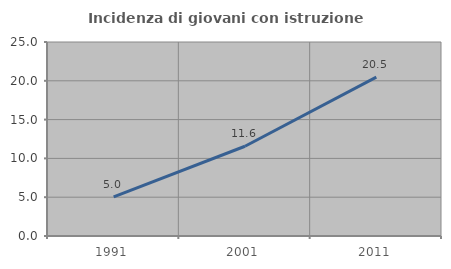
| Category | Incidenza di giovani con istruzione universitaria |
|---|---|
| 1991.0 | 5.036 |
| 2001.0 | 11.565 |
| 2011.0 | 20.472 |